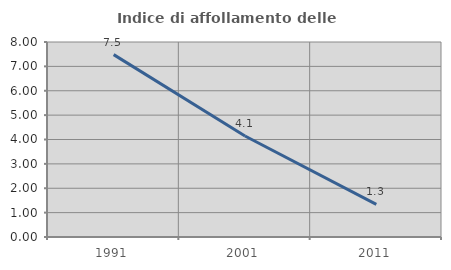
| Category | Indice di affollamento delle abitazioni  |
|---|---|
| 1991.0 | 7.482 |
| 2001.0 | 4.143 |
| 2011.0 | 1.338 |